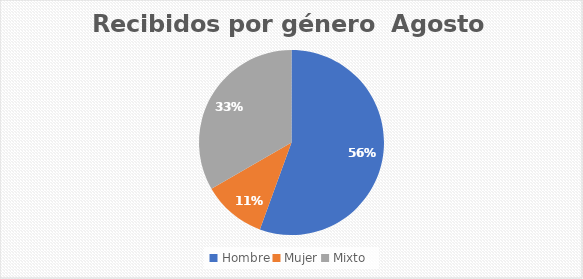
| Category | Recibidos por género  Agosto |
|---|---|
| Hombre | 5 |
| Mujer | 1 |
| Mixto | 3 |